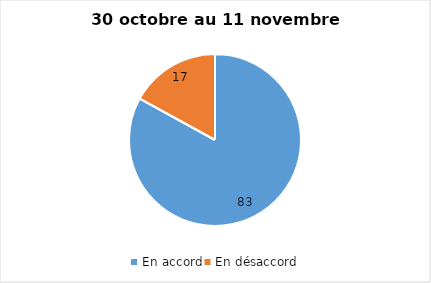
| Category | Series 0 |
|---|---|
| En accord | 83 |
| En désaccord | 17 |